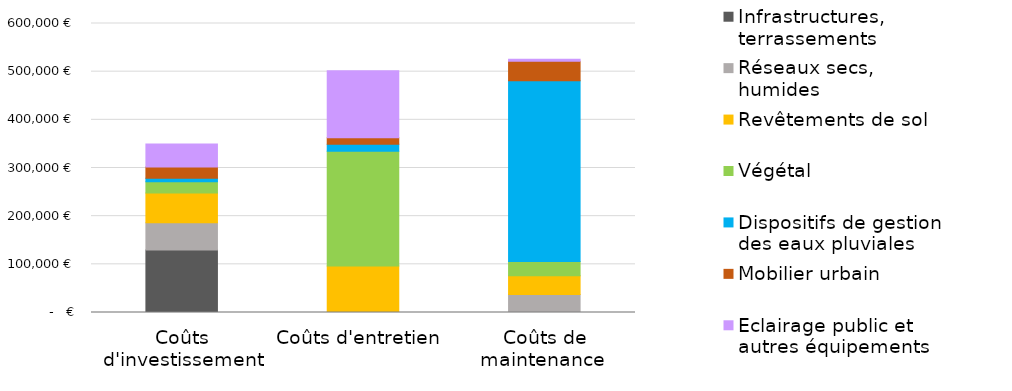
| Category | Infrastructures, terrassements | Réseaux secs, humides | Revêtements de sol  | Végétal | Dispositifs de gestion des eaux pluviales | Mobilier urbain | Eclairage public et autres équipements |
|---|---|---|---|---|---|---|---|
| Coûts d'investissement | 129500 | 57000 | 61500 | 23600 | 7250 | 23220 | 47900 |
| Coûts d'entretien  | 0 | 420 | 96000 | 238200 | 14700 | 13650 | 138900 |
| Coûts de maintenance  | 0 | 37200 | 38850 | 29970 | 375000 | 40425.9 | 4500.39 |